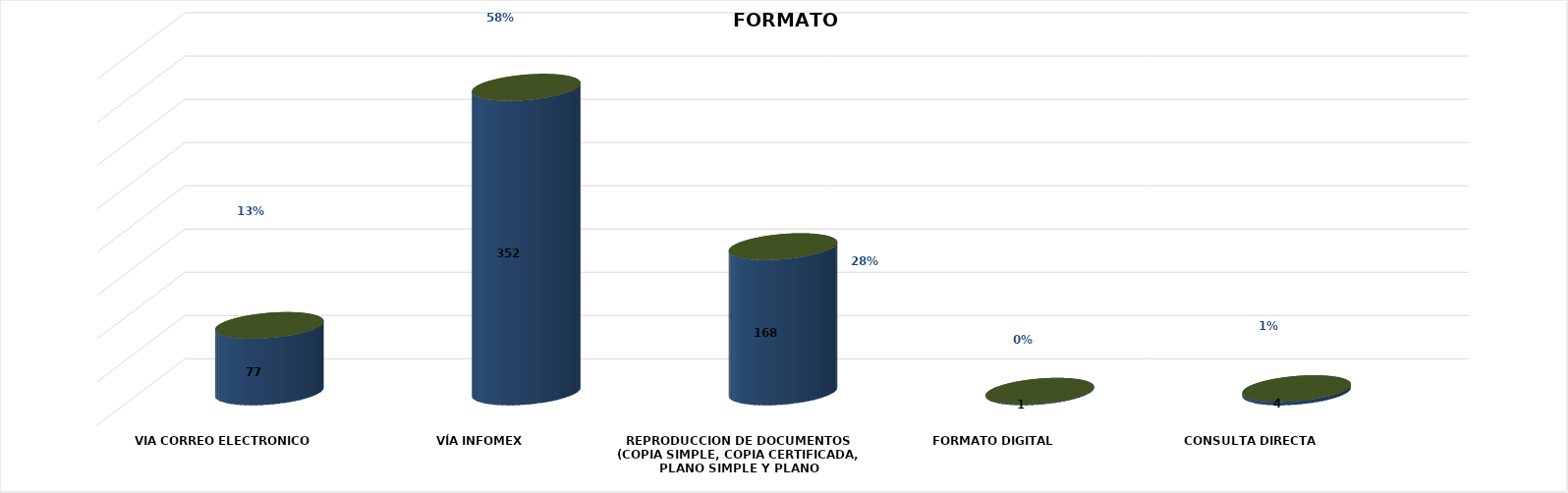
| Category | Series 0 | Series 1 | Series 2 | Series 3 | Series 4 |
|---|---|---|---|---|---|
| VIA CORREO ELECTRONICO |  |  |  | 77 | 0.128 |
| VÍA INFOMEX |  |  |  | 352 | 0.585 |
| REPRODUCCION DE DOCUMENTOS (COPIA SIMPLE, COPIA CERTIFICADA, PLANO SIMPLE Y PLANO CERTIFICADO) |  |  |  | 168 | 0.279 |
| FORMATO DIGITAL |  |  |  | 1 | 0.002 |
| CONSULTA DIRECTA |  |  |  | 4 | 0.007 |